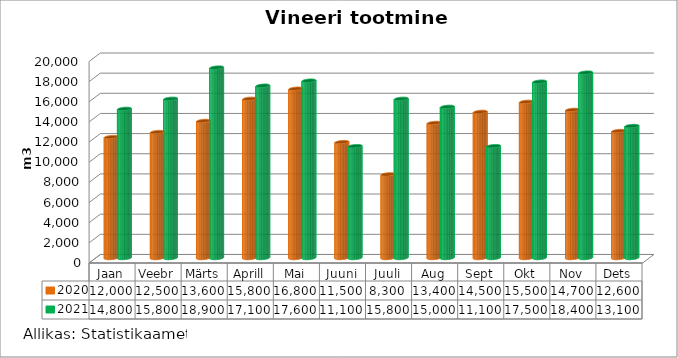
| Category | 2020 | 2021 |
|---|---|---|
| Jaan | 12000 | 14800 |
| Veebr | 12500 | 15800 |
| Märts | 13600 | 18900 |
| Aprill | 15800 | 17100 |
| Mai | 16800 | 17600 |
| Juuni | 11500 | 11100 |
| Juuli | 8300 | 15800 |
| Aug | 13400 | 15000 |
| Sept | 14500 | 11100 |
| Okt | 15500 | 17500 |
| Nov | 14700 | 18400 |
| Dets | 12600 | 13100 |